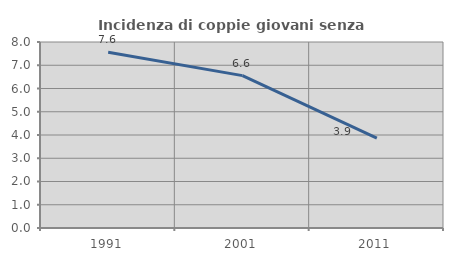
| Category | Incidenza di coppie giovani senza figli |
|---|---|
| 1991.0 | 7.563 |
| 2001.0 | 6.553 |
| 2011.0 | 3.862 |